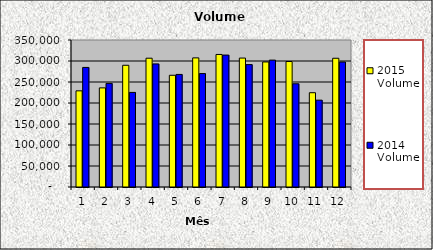
| Category | 2015 Volume | 2014 Volume |
|---|---|---|
| 0 | 228973.333 | 284700 |
| 1 | 235993.333 | 246653.333 |
| 2 | 289813.333 | 225203.333 |
| 3 | 306626.667 | 293063.333 |
| 4 | 266023.333 | 268016.667 |
| 5 | 307406.667 | 270053.333 |
| 6 | 315553 | 314123.333 |
| 7 | 306961.113 | 291416.667 |
| 8 | 297746.4 | 302097.38 |
| 9 | 298776.53 | 245817 |
| 10 | 224483 | 206743.333 |
| 11 | 306532 | 297526.667 |